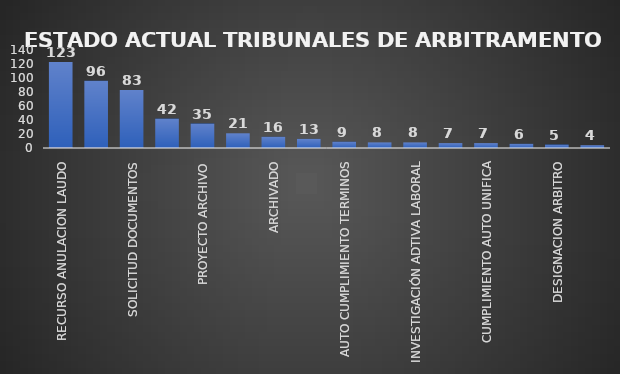
| Category | CANTIDAD | % |
|---|---|---|
| RECURSO ANULACION LAUDO | 123 | 0.252 |
| ESPERA LAUDO | 96 | 0.179 |
| SOLICITUD DOCUMENTOS | 83 | 0.156 |
| PAGO HONORARIOS | 42 | 0.077 |
| PROYECTO ARCHIVO | 35 | 0.081 |
| ESTUDIO DOCUMENTOS  | 21 | 0.047 |
| ARCHIVADO | 16 | 0.03 |
| POSESION ARBITROS | 13 | 0.025 |
| AUTO CUMPLIMIENTO TERMINOS | 9 | 0.025 |
| FIRMA CONVOCAE INTEGRA | 8 | 0.015 |
| INVESTIGACIÓN ADTIVA LABORAL | 8 | 0.014 |
| PROYECTO AUTO UNIFICA | 7 | 0.009 |
| CUMPLIMIENTO AUTO UNIFICA | 7 | 0.014 |
| DESIGNACION TERCER ARBITRO | 6 | 0.015 |
| DESIGNACION ARBITRO | 5 | 0.012 |
| COMUNICACIÓN ACTO ADMINISTRATIVO | 4 | 0.008 |